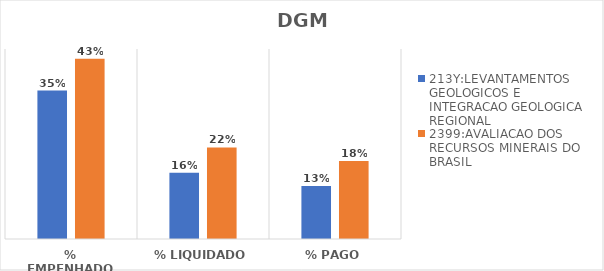
| Category | 213Y:LEVANTAMENTOS GEOLOGICOS E INTEGRACAO GEOLOGICA REGIONAL | 2399:AVALIACAO DOS RECURSOS MINERAIS DO BRASIL |
|---|---|---|
| % EMPENHADO | 0.352 | 0.427 |
| % LIQUIDADO | 0.157 | 0.217 |
| % PAGO | 0.126 | 0.185 |